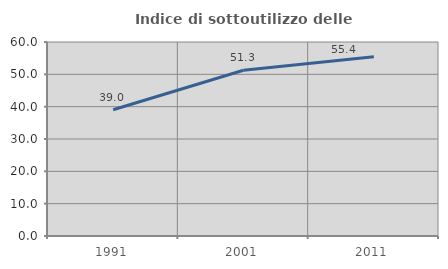
| Category | Indice di sottoutilizzo delle abitazioni  |
|---|---|
| 1991.0 | 39.041 |
| 2001.0 | 51.25 |
| 2011.0 | 55.429 |